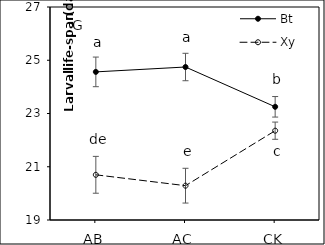
| Category | Bt | Xy |
|---|---|---|
| AB | 24.563 | 20.697 |
| AC | 24.746 | 20.289 |
| CK | 23.252 | 22.354 |